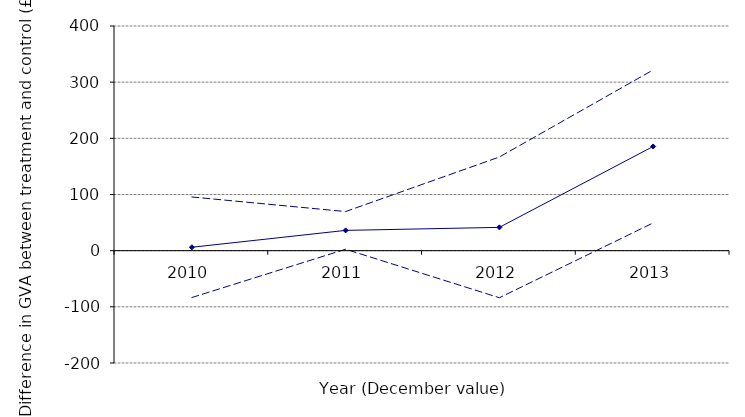
| Category | MeanDiff | FivePercent | NinetyFivePercent |
|---|---|---|---|
| 2010.0 | 6.079 | -83.424 | 95.582 |
| 2011.0 | 36.104 | 2.569 | 69.639 |
| 2012.0 | 41.481 | -83.795 | 166.757 |
| 2013.0 | 185.54 | 49.335 | 321.745 |